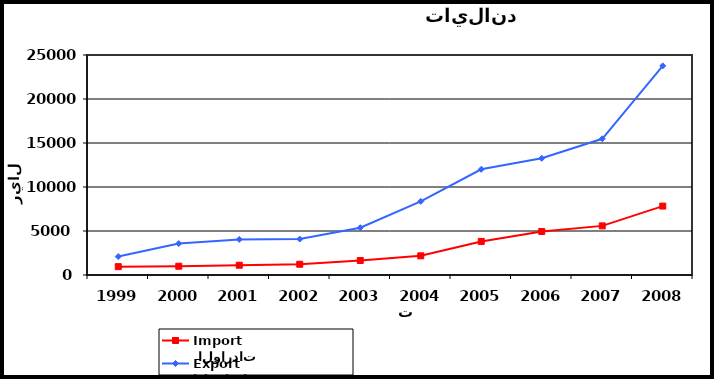
| Category |  الواردات           Import | الصادرات          Export |
|---|---|---|
| 1999.0 | 949 | 2100 |
| 2000.0 | 996 | 3578 |
| 2001.0 | 1110 | 4042 |
| 2002.0 | 1222 | 4085 |
| 2003.0 | 1651 | 5376 |
| 2004.0 | 2179 | 8365 |
| 2005.0 | 3817 | 12016 |
| 2006.0 | 4946 | 13264 |
| 2007.0 | 5582 | 15480 |
| 2008.0 | 7832 | 23765 |